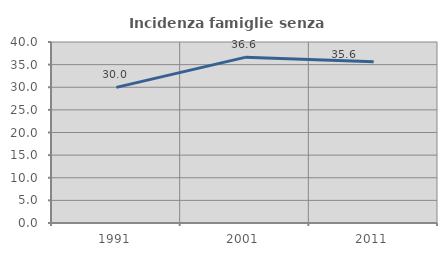
| Category | Incidenza famiglie senza nuclei |
|---|---|
| 1991.0 | 29.969 |
| 2001.0 | 36.606 |
| 2011.0 | 35.64 |